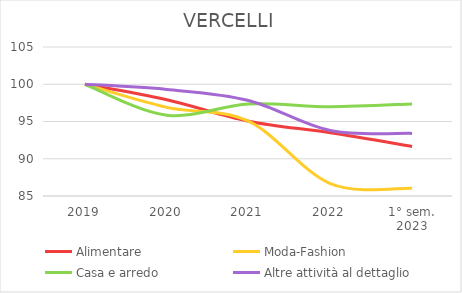
| Category | Alimentare | Moda-Fashion | Casa e arredo | Altre attività al dettaglio |
|---|---|---|---|---|
| 2019 | 100 | 100 | 100 | 100 |
| 2020 | 97.914 | 96.899 | 95.849 | 99.302 |
| 2021 | 95.046 | 95.039 | 97.358 | 97.828 |
| 2022 | 93.481 | 86.667 | 96.981 | 93.794 |
| 1° sem.
2023 | 91.656 | 86.047 | 97.358 | 93.406 |